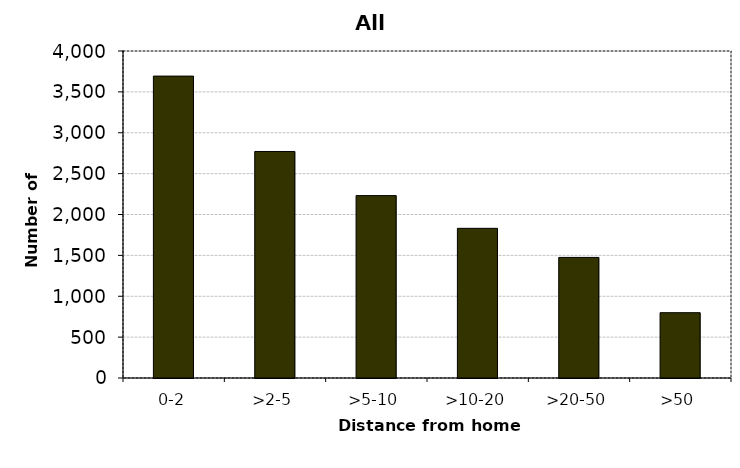
| Category | All drivers |
|---|---|
| 0-2 | 3693 |
| >2-5 | 2771 |
| >5-10 | 2231 |
| >10-20 | 1831 |
| >20-50 | 1475 |
| >50 | 799 |